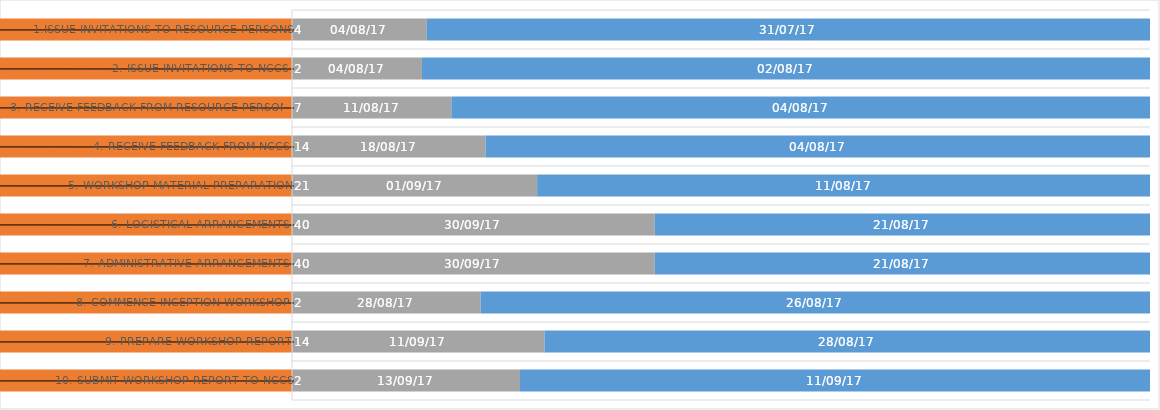
| Category | DURATION (days) | END DATE | START DATE |
|---|---|---|---|
| 1.Issue invitations to resource persons | 4 | 2017-08-04 | 2017-07-31 |
| 2. Issue invitations to NCCs | 2 | 2017-08-04 | 2017-08-02 |
| 3. Receive feedback from resource persons | 7 | 2017-08-11 | 2017-08-04 |
| 4. Receive feedback from NCCs | 14 | 2017-08-18 | 2017-08-04 |
| 5. Workshop material preparation | 21 | 2017-09-01 | 2017-08-11 |
| 6. Logistical arrangements | 40 | 2017-09-30 | 2017-08-21 |
| 7. Administrative arrangements | 40 | 2017-09-30 | 2017-08-21 |
| 8. Commence Inception Workshop | 2 | 2017-08-28 | 2017-08-26 |
| 9. Prepare Workshop Report | 14 | 2017-09-11 | 2017-08-28 |
| 10. Submit Workshop Report to NCCs | 2 | 2017-09-13 | 2017-09-11 |